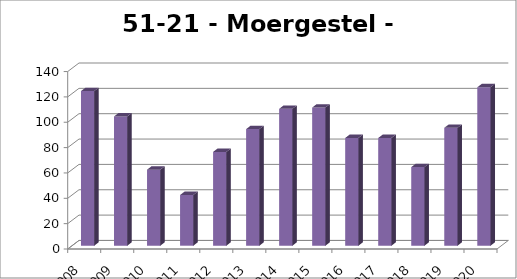
| Category | Moergestel - Haghorst |
|---|---|
| 2008.0 | 122 |
| 2009.0 | 102 |
| 2010.0 | 60 |
| 2011.0 | 40 |
| 2012.0 | 74 |
| 2013.0 | 92 |
| 2014.0 | 108 |
| 2015.0 | 109 |
| 2016.0 | 85 |
| 2017.0 | 85 |
| 2018.0 | 62 |
| 2019.0 | 93 |
| 2020.0 | 125 |